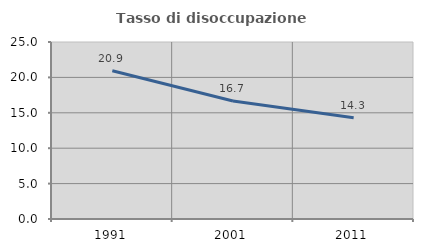
| Category | Tasso di disoccupazione giovanile  |
|---|---|
| 1991.0 | 20.93 |
| 2001.0 | 16.667 |
| 2011.0 | 14.286 |